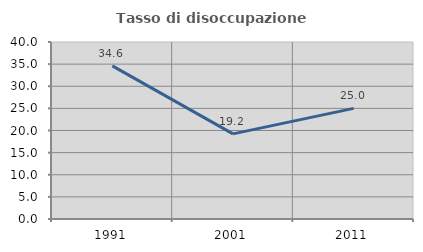
| Category | Tasso di disoccupazione giovanile  |
|---|---|
| 1991.0 | 34.615 |
| 2001.0 | 19.231 |
| 2011.0 | 25 |